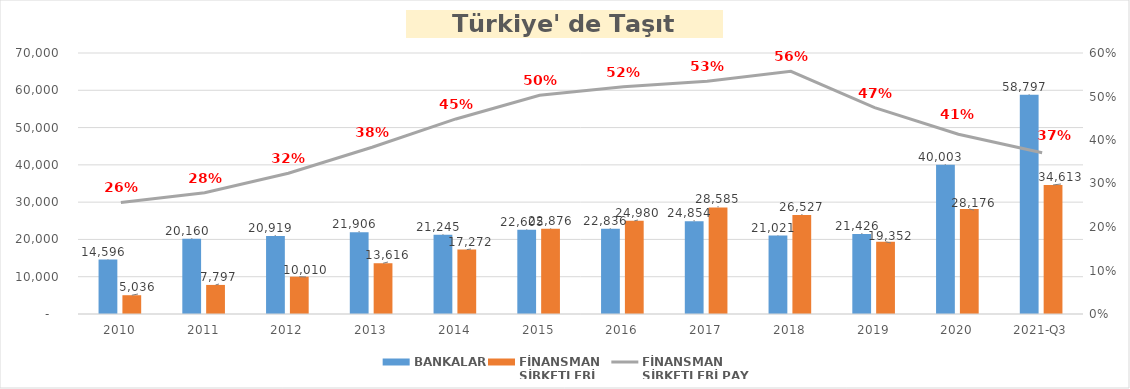
| Category | BANKALAR | FİNANSMAN 
ŞİRKETLERİ |
|---|---|---|
| 2010 | 14595.746 | 5035.89 |
| 2011 | 20160.143 | 7796.854 |
| 2012 | 20919.143 | 10009.755 |
| 2013 | 21905.99 | 13616.036 |
| 2014 | 21244.953 | 17271.844 |
| 2015 | 22605.033 | 22875.563 |
| 2016 | 22835.961 | 24980.231 |
| 2017 | 24853.571 | 28584.938 |
| 2018 | 21021.01 | 26527.133 |
| 2019 | 21426.278 | 19352.327 |
| 2020 | 40002.964 | 28176.3 |
| 2021-Q3 | 58797.203 | 34612.917 |